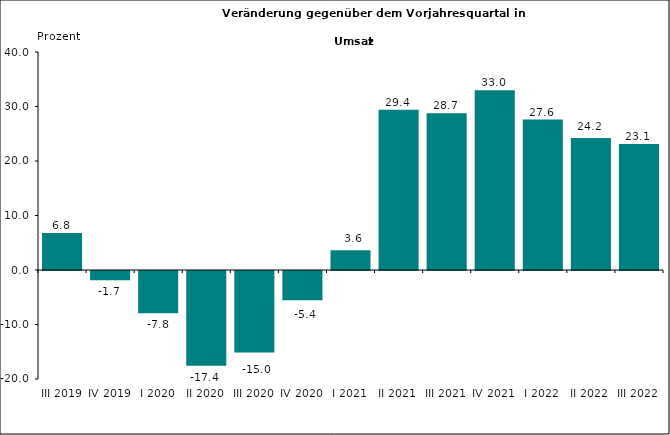
| Category | Series 0 |
|---|---|
| III 2019 | 6.777 |
| IV 2019 | -1.702 |
| I 2020 | -7.775 |
| II 2020 | -17.405 |
| III 2020 | -14.955 |
| IV 2020 | -5.368 |
| I 2021 | 3.627 |
| II 2021 | 29.396 |
| III 2021 | 28.748 |
| IV 2021 | 33 |
| I 2022 | 27.6 |
| II 2022 | 24.2 |
| III 2022 | 23.1 |